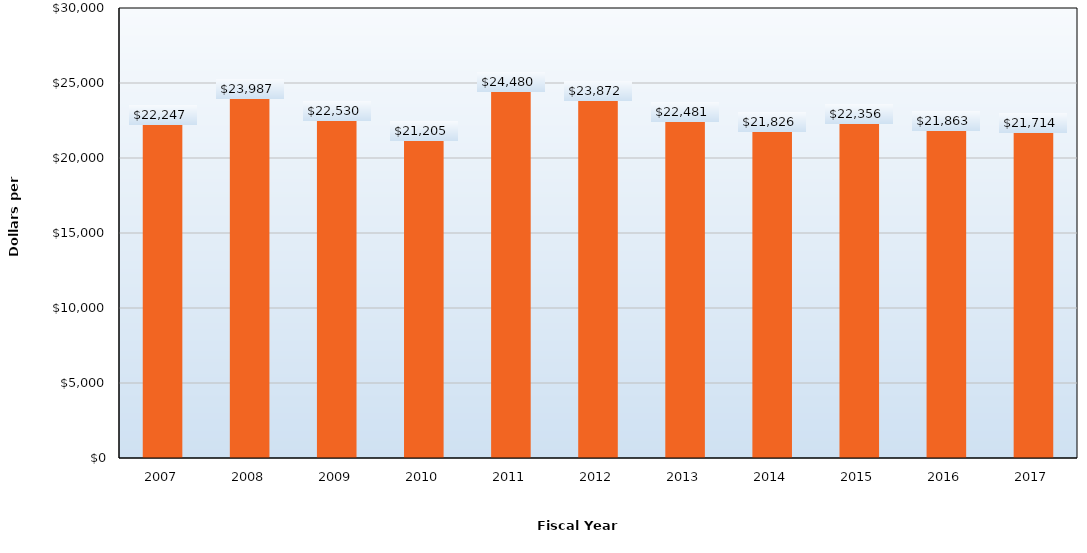
| Category | Dollars per FTE |
|---|---|
| 2007.0 | 22247 |
| 2008.0 | 23987 |
| 2009.0 | 22530 |
| 2010.0 | 21205 |
| 2011.0 | 24480 |
| 2012.0 | 23872 |
| 2013.0 | 22481 |
| 2014.0 | 21826 |
| 2015.0 | 22356 |
| 2016.0 | 21863 |
| 2017.0 | 21714 |